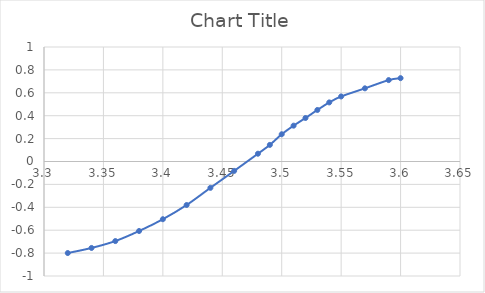
| Category | Series 0 |
|---|---|
| 3.32 | -0.8 |
| 3.34 | -0.755 |
| 3.36 | -0.695 |
| 3.38 | -0.607 |
| 3.4 | -0.504 |
| 3.42 | -0.38 |
| 3.44 | -0.23 |
| 3.46 | -0.082 |
| 3.48 | 0.068 |
| 3.49 | 0.145 |
| 3.5 | 0.238 |
| 3.51 | 0.313 |
| 3.52 | 0.38 |
| 3.53 | 0.45 |
| 3.54 | 0.516 |
| 3.55 | 0.568 |
| 3.57 | 0.639 |
| 3.59 | 0.711 |
| 3.6 | 0.728 |